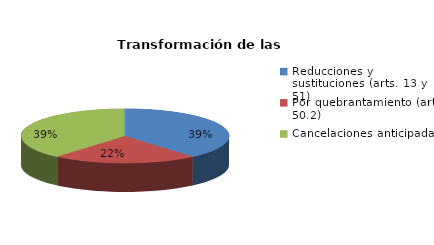
| Category | Series 0 |
|---|---|
| Reducciones y sustituciones (arts. 13 y 51) | 19 |
| Por quebrantamiento (art. 50.2) | 11 |
| Cancelaciones anticipadas | 19 |
| Traslado a Centros Penitenciarios | 0 |
| Conversión internamientos en cerrados (art. 51.2) | 0 |